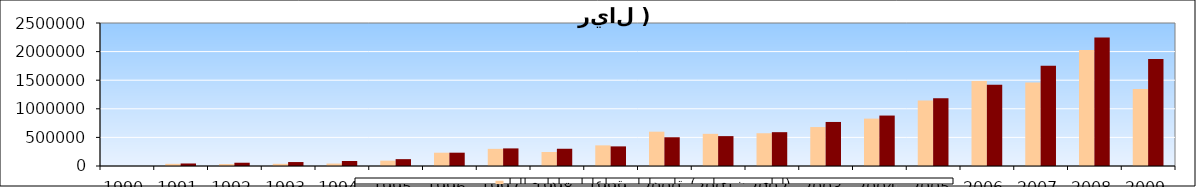
| Category | الايرادات العامة للدولة (مليون ريال) | النفقات العامة للدولة   (مليون ريال )  |
|---|---|---|
| 1990.0 | 0 | 0 |
| 1991.0 | 37999 | 44070 |
| 1992.0 | 34170 | 57043 |
| 1993.0 | 38124 | 68984 |
| 1994.0 | 42857 | 87128 |
| 1995.0 | 93314 | 119880 |
| 1996.0 | 232225 | 232755 |
| 1997.0 | 299752 | 307568 |
| 1998.0 | 244570 | 301431 |
| 1999.0 | 360791 | 342933 |
| 2000.0 | 599902 | 502440 |
| 2001.0 | 562079 | 522367 |
| 2002.0 | 572712 | 591451 |
| 2003.0 | 680827 | 769888 |
| 2004.0 | 828354 | 881853 |
| 2005.0 | 1145185 | 1184328 |
| 2006.0 | 1484581 | 1420642 |
| 2007.0 | 1460500 | 1754782 |
| 2008.0 | 2027789 | 2248166 |
| 2009.0 | 1348153 | 1872224 |